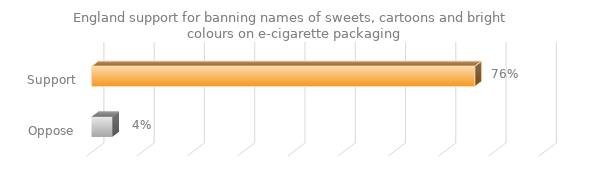
| Category | England support for banning names of sweets, cartoons and bright colours on e-cigarette packaging |
|---|---|
| Support | 0.762 |
| Oppose | 0.041 |